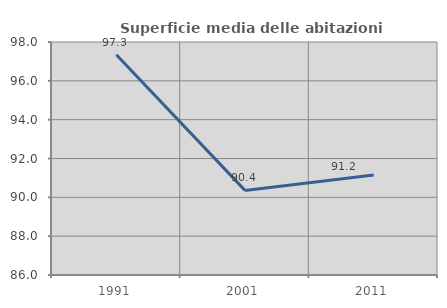
| Category | Superficie media delle abitazioni occupate |
|---|---|
| 1991.0 | 97.342 |
| 2001.0 | 90.357 |
| 2011.0 | 91.153 |